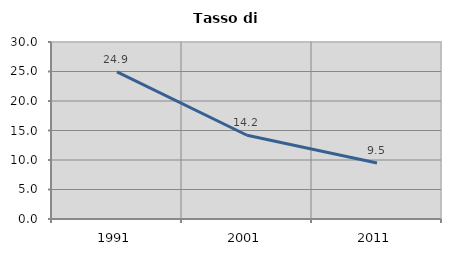
| Category | Tasso di disoccupazione   |
|---|---|
| 1991.0 | 24.946 |
| 2001.0 | 14.192 |
| 2011.0 | 9.489 |